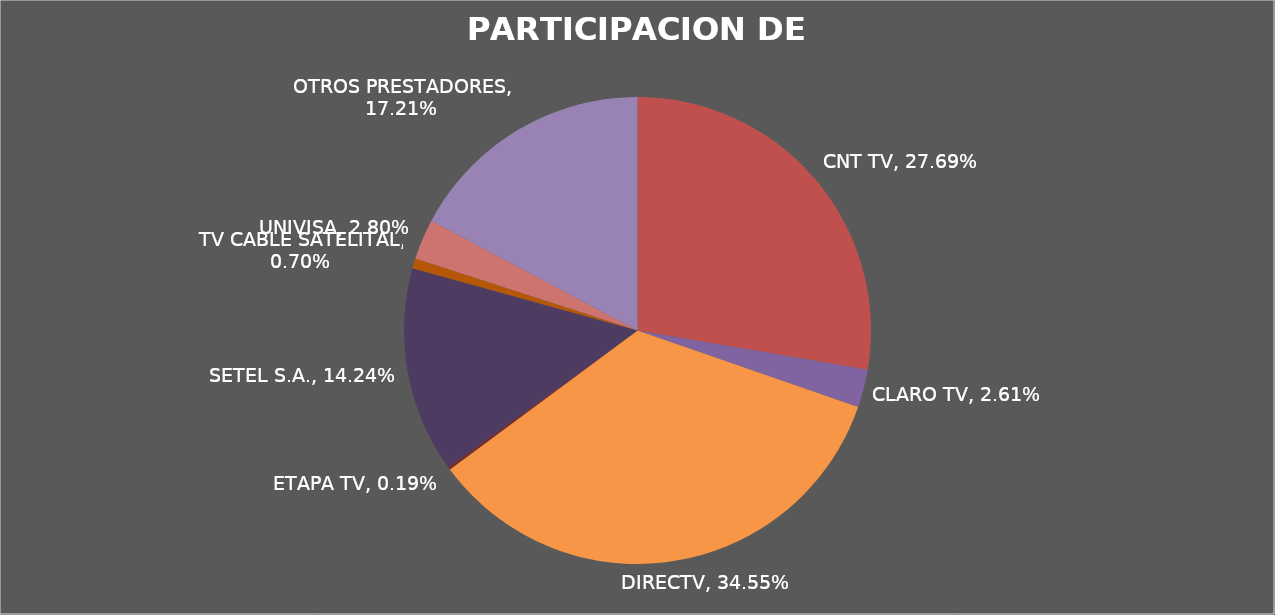
| Category | PARTICIPACION DE MERCADO |
|---|---|
| CNT TV | 0.277 |
| CLARO TV | 0.026 |
| DIRECTV | 0.345 |
| ETAPA TV | 0.002 |
| SETEL S.A. | 0.142 |
| TV CABLE SATELITAL | 0.007 |
| UNIVISA | 0.028 |
| OTROS PRESTADORES | 0.172 |